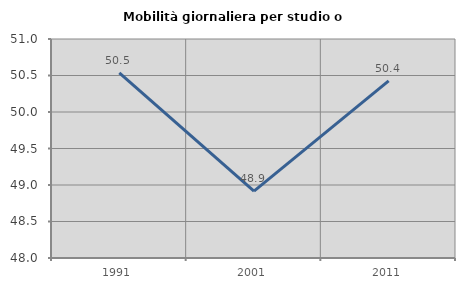
| Category | Mobilità giornaliera per studio o lavoro |
|---|---|
| 1991.0 | 50.537 |
| 2001.0 | 48.917 |
| 2011.0 | 50.428 |